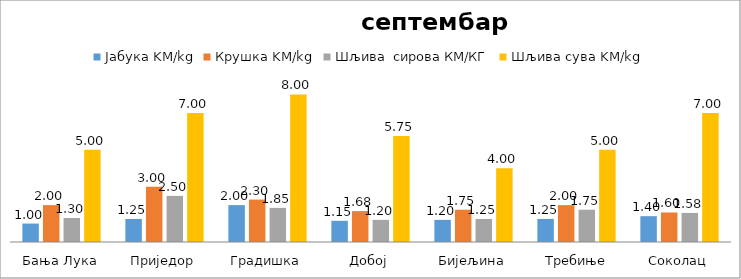
| Category | Јабука KM/kg | Крушка KM/kg | Шљива  сирова КМ/КГ | Шљива сува KM/kg |
|---|---|---|---|---|
| Бања Лука | 1 | 2 | 1.3 | 5 |
| Приједор | 1.25 | 3 | 2.5 | 7 |
| Градишка | 2 | 2.3 | 1.85 | 8 |
| Добој | 1.15 | 1.675 | 1.2 | 5.75 |
| Бијељина | 1.2 | 1.75 | 1.25 | 4 |
|  Требиње | 1.25 | 2 | 1.75 | 5 |
| Соколац | 1.4 | 1.6 | 1.575 | 7 |